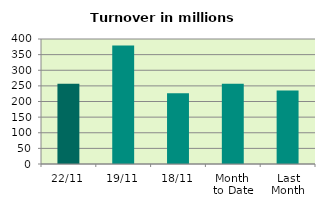
| Category | Series 0 |
|---|---|
| 22/11 | 257.12 |
| 19/11 | 379.489 |
| 18/11 | 226.656 |
| Month 
to Date | 256.876 |
| Last
Month | 235.36 |